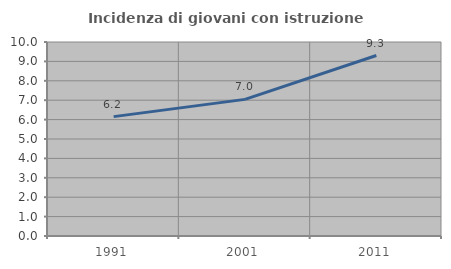
| Category | Incidenza di giovani con istruzione universitaria |
|---|---|
| 1991.0 | 6.154 |
| 2001.0 | 7.042 |
| 2011.0 | 9.302 |